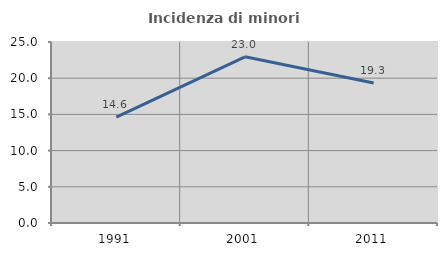
| Category | Incidenza di minori stranieri |
|---|---|
| 1991.0 | 14.615 |
| 2001.0 | 22.953 |
| 2011.0 | 19.343 |